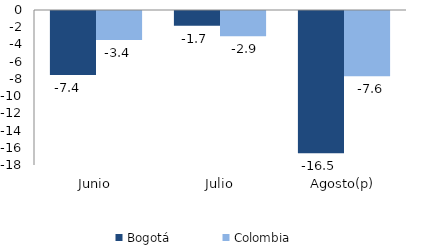
| Category | Bogotá | Colombia |
|---|---|---|
| Junio | -7.42 | -3.357 |
| Julio | -1.708 | -2.918 |
| Agosto(p) | -16.522 | -7.591 |